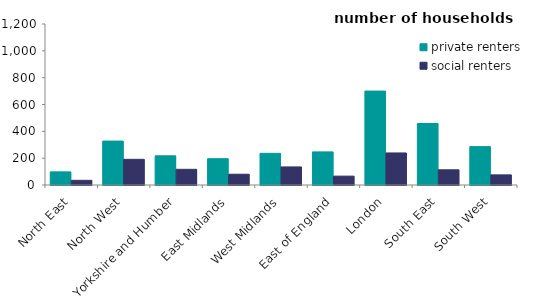
| Category | private renters | social renters |
|---|---|---|
| North East | 97.885 | 34.753 |
| North West | 327.351 | 191.36 |
| Yorkshire and Humber | 217.571 | 116.819 |
| East Midlands | 195.959 | 80.357 |
| West Midlands | 235.982 | 134.696 |
| East of England | 246.633 | 66.139 |
| London | 700.065 | 238.846 |
| South East | 458.441 | 113.306 |
| South West | 285.874 | 75.528 |